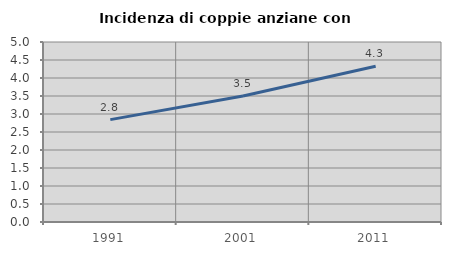
| Category | Incidenza di coppie anziane con figli |
|---|---|
| 1991.0 | 2.844 |
| 2001.0 | 3.499 |
| 2011.0 | 4.324 |